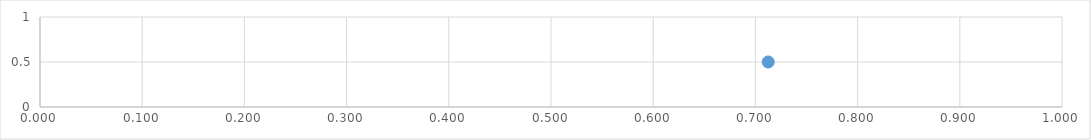
| Category | Series 0 |
|---|---|
| 0.7125118623521994 | 0.5 |